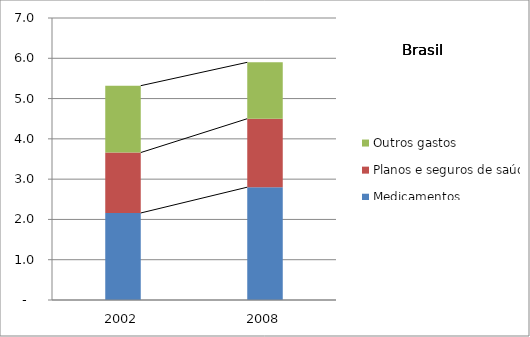
| Category | Medicamentos | Planos e seguros de saúde | Outros gastos |
|---|---|---|---|
| 2002.0 | 2.16 | 1.5 | 1.66 |
| 2008.0 | 2.8 | 1.7 | 1.4 |